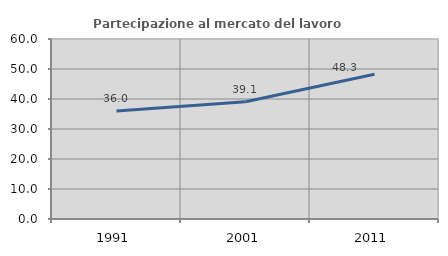
| Category | Partecipazione al mercato del lavoro  femminile |
|---|---|
| 1991.0 | 36.004 |
| 2001.0 | 39.082 |
| 2011.0 | 48.256 |